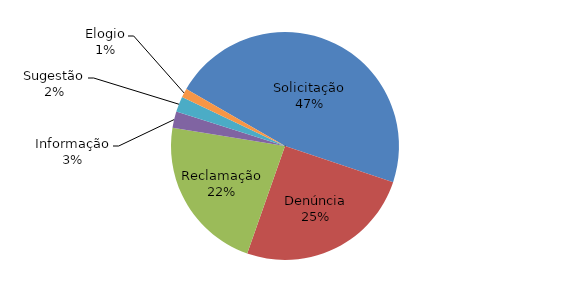
| Category | Series 0 |
|---|---|
| Solicitação | 812 |
| Denúncia | 438 |
| Reclamação | 385 |
| Informação | 40 |
| Sugestão | 38 |
| Elogio | 22 |